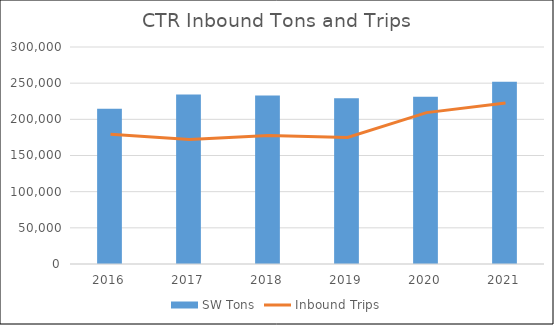
| Category | SW Tons |
|---|---|
| 2016.0 | 214570 |
| 2017.0 | 234254 |
| 2018.0 | 233044 |
| 2019.0 | 229036 |
| 2020.0 | 231127.18 |
| 2021.0 | 251847.16 |